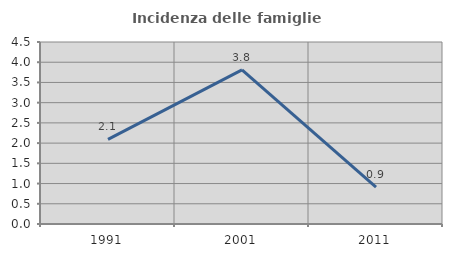
| Category | Incidenza delle famiglie numerose |
|---|---|
| 1991.0 | 2.092 |
| 2001.0 | 3.812 |
| 2011.0 | 0.909 |